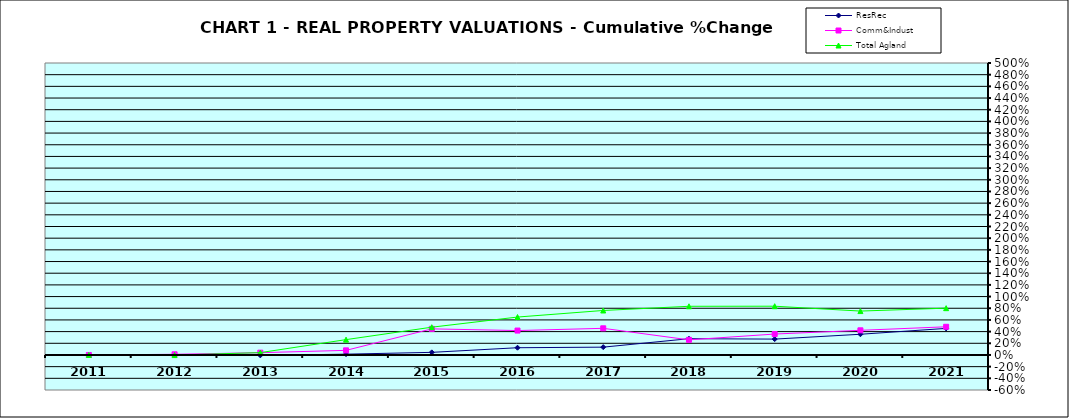
| Category | ResRec | Comm&Indust | Total Agland |
|---|---|---|---|
| 2011.0 | 0 | 0 | 0 |
| 2012.0 | -0.008 | 0.012 | -0.002 |
| 2013.0 | -0.007 | 0.039 | 0.04 |
| 2014.0 | 0.014 | 0.079 | 0.263 |
| 2015.0 | 0.045 | 0.447 | 0.476 |
| 2016.0 | 0.124 | 0.418 | 0.649 |
| 2017.0 | 0.134 | 0.456 | 0.762 |
| 2018.0 | 0.278 | 0.259 | 0.834 |
| 2019.0 | 0.272 | 0.358 | 0.835 |
| 2020.0 | 0.355 | 0.422 | 0.752 |
| 2021.0 | 0.455 | 0.483 | 0.802 |